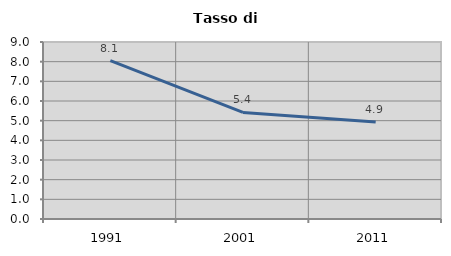
| Category | Tasso di disoccupazione   |
|---|---|
| 1991.0 | 8.051 |
| 2001.0 | 5.419 |
| 2011.0 | 4.926 |